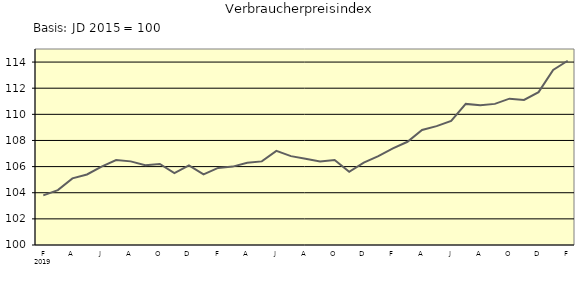
| Category | Series 0 |
|---|---|
| 0 | 103.8 |
| 1 | 104.2 |
| 2 | 105.1 |
| 3 | 105.4 |
| 4 | 106 |
| 5 | 106.5 |
| 6 | 106.4 |
| 7 | 106.1 |
| 8 | 106.2 |
| 9 | 105.5 |
| 10 | 106.1 |
| 11 | 105.4 |
| 12 | 105.9 |
| 13 | 106 |
| 14 | 106.3 |
| 15 | 106.4 |
| 16 | 107.2 |
| 17 | 106.8 |
| 18 | 106.6 |
| 19 | 106.4 |
| 20 | 106.5 |
| 21 | 105.6 |
| 22 | 106.3 |
| 23 | 106.8 |
| 24 | 107.4 |
| 25 | 107.9 |
| 26 | 108.8 |
| 27 | 109.1 |
| 28 | 109.5 |
| 29 | 110.8 |
| 30 | 110.7 |
| 31 | 110.8 |
| 32 | 111.2 |
| 33 | 111.1 |
| 34 | 111.7 |
| 35 | 113.4 |
| 36 | 114.1 |